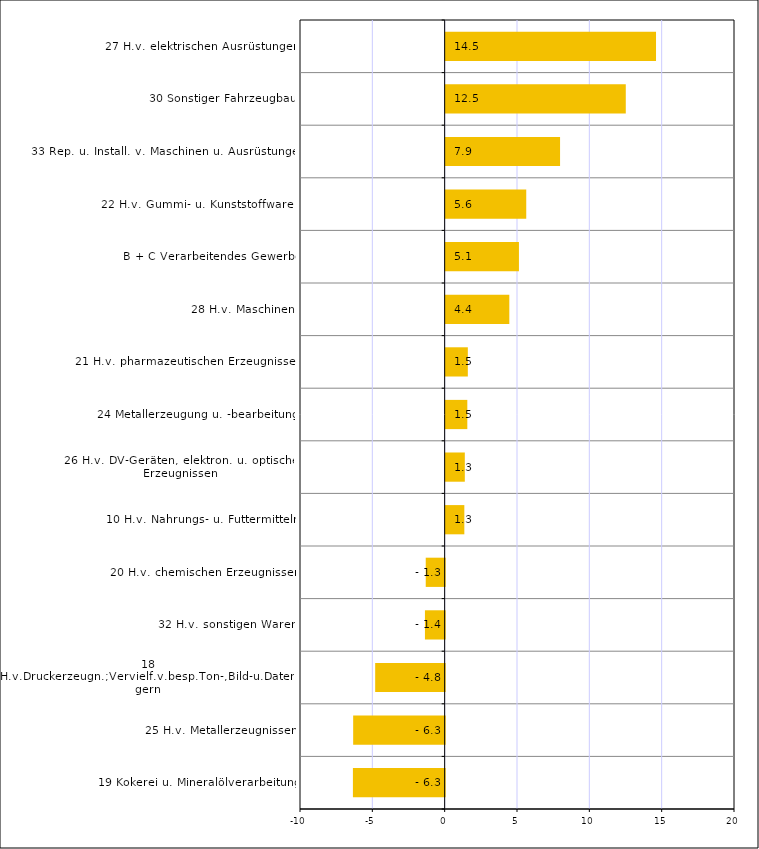
| Category | Series 0 |
|---|---|
| 19 Kokerei u. Mineralölverarbeitung | -6.343 |
| 25 H.v. Metallerzeugnissen | -6.325 |
| 18 H.v.Druckerzeugn.;Vervielf.v.besp.Ton-,Bild-u.Datenträgern | -4.803 |
| 32 H.v. sonstigen Waren | -1.364 |
| 20 H.v. chemischen Erzeugnissen | -1.309 |
| 10 H.v. Nahrungs- u. Futtermitteln | 1.29 |
| 26 H.v. DV-Geräten, elektron. u. optischen Erzeugnissen | 1.324 |
| 24 Metallerzeugung u. -bearbeitung | 1.497 |
| 21 H.v. pharmazeutischen Erzeugnissen | 1.532 |
| 28 H.v. Maschinen | 4.4 |
| B + C Verarbeitendes Gewerbe | 5.065 |
| 22 H.v. Gummi- u. Kunststoffwaren | 5.57 |
| 33 Rep. u. Install. v. Maschinen u. Ausrüstungen | 7.907 |
| 30 Sonstiger Fahrzeugbau | 12.45 |
| 27 H.v. elektrischen Ausrüstungen | 14.54 |